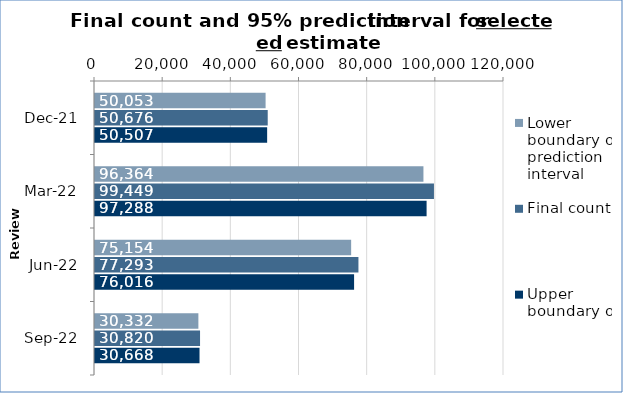
| Category | Lower boundary of prediction interval | Final count | Upper boundary of prediction interval |
|---|---|---|---|
| 2021-12-01 | 50053 | 50676 | 50507 |
| 2022-03-01 | 96364 | 99449 | 97288 |
| 2022-06-01 | 75154 | 77293 | 76016 |
| 2022-09-01 | 30332 | 30820 | 30668 |